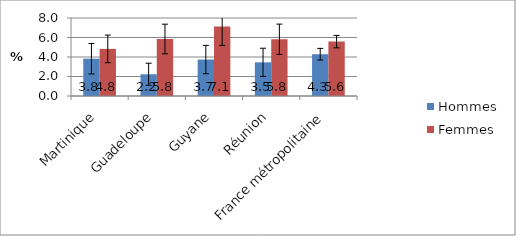
| Category | Hommes | Femmes |
|---|---|---|
| Martinique | 3.828 | 4.831 |
| Guadeloupe | 2.232 | 5.846 |
| Guyane | 3.741 | 7.125 |
| Réunion | 3.453 | 5.821 |
| France métropolitaine | 4.286 | 5.578 |